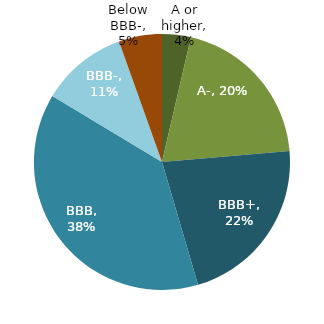
| Category | Series 0 |
|---|---|
| A or higher | 0.036 |
| A- | 0.2 |
| BBB+ | 0.218 |
| BBB | 0.382 |
| BBB- | 0.109 |
| Below BBB- | 0.055 |